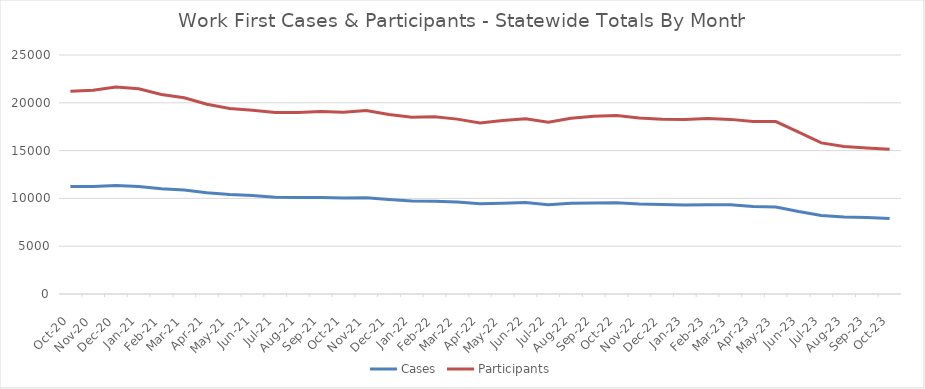
| Category | Cases | Participants |
|---|---|---|
| 2023-10-23 | 7909 | 15129 |
| 2023-09-23 | 7993 | 15261 |
| 2023-08-23 | 8048 | 15431 |
| 2023-07-23 | 8201 | 15804 |
| 2023-06-23 | 8626 | 16926 |
| 2023-05-23 | 9109 | 18037 |
| 2023-04-23 | 9158 | 18032 |
| 2023-03-23 | 9330 | 18266 |
| 2023-02-01 | 9348 | 18367 |
| 2023-01-01 | 9307 | 18258 |
| 2022-12-01 | 9357 | 18283 |
| 2022-11-22 | 9423 | 18412 |
| 2022-10-22 | 9547 | 18673 |
| 2022-09-22 | 9528 | 18586 |
| 2022-08-22 | 9505 | 18379 |
| 2022-07-22 | 9349 | 17973 |
| 2022-06-22 | 9561 | 18334 |
| 2022-05-22 | 9493 | 18139 |
| 2022-04-22 | 9434 | 17898 |
| 2022-03-22 | 9625 | 18293 |
| 2022-02-22 | 9713 | 18537 |
| 2022-01-22 | 9733 | 18484 |
| 2021-12-21 | 9885 | 18776 |
| 2021-11-21 | 10056 | 19192 |
| 2021-10-21 | 10034 | 19005 |
| 2021-09-21 | 10102 | 19085 |
| 2021-08-21 | 10090 | 18974 |
| 2021-07-21 | 10121 | 18988 |
| 2021-06-21 | 10298 | 19211 |
| 2021-05-21 | 10411 | 19413 |
| 2021-04-21 | 10601 | 19845 |
| 2021-03-21 | 10888 | 20521 |
| 2021-02-21 | 11007 | 20877 |
| 2021-01-21 | 11252 | 21466 |
| 2020-12-20 | 11350 | 21641 |
| 2020-11-20 | 11255 | 21305 |
| 2020-10-20 | 11243 | 21198 |